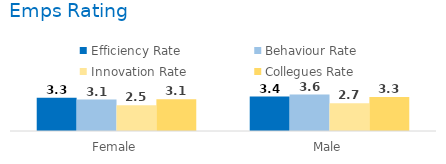
| Category | Efficiency Rate | Behaviour Rate | Innovation Rate | Collegues Rate |
|---|---|---|---|---|
| Female | 3.253 | 3.067 | 2.507 | 3.107 |
| Male | 3.366 | 3.561 | 2.707 | 3.317 |